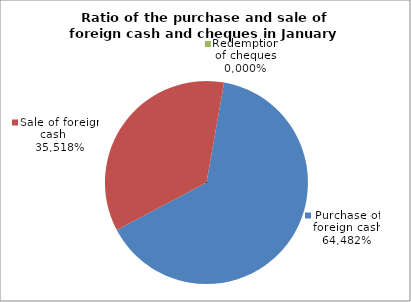
| Category | Purchase of foreign cash |
|---|---|
| 0 | 0.645 |
| 1 | 0.355 |
| 2 | 0 |